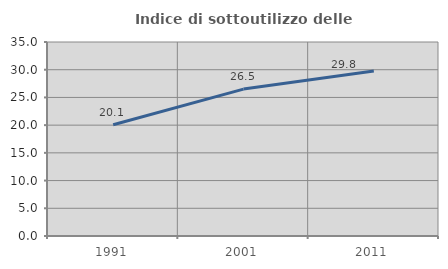
| Category | Indice di sottoutilizzo delle abitazioni  |
|---|---|
| 1991.0 | 20.082 |
| 2001.0 | 26.504 |
| 2011.0 | 29.766 |